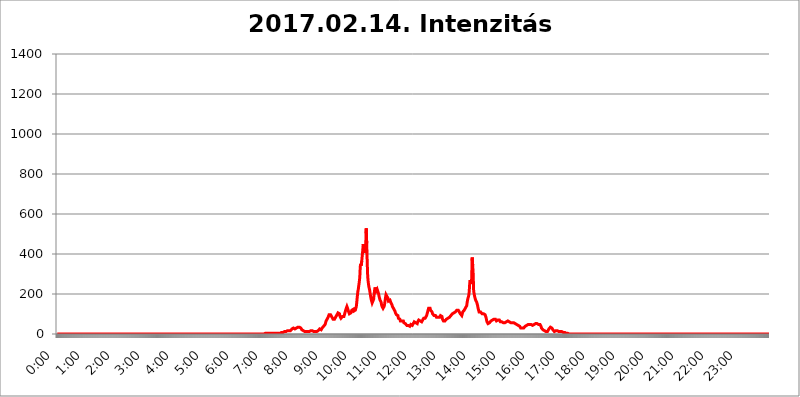
| Category | 2017.02.14. Intenzitás [W/m^2] |
|---|---|
| 0.0 | 0 |
| 0.0006944444444444445 | 0 |
| 0.001388888888888889 | 0 |
| 0.0020833333333333333 | 0 |
| 0.002777777777777778 | 0 |
| 0.003472222222222222 | 0 |
| 0.004166666666666667 | 0 |
| 0.004861111111111111 | 0 |
| 0.005555555555555556 | 0 |
| 0.0062499999999999995 | 0 |
| 0.006944444444444444 | 0 |
| 0.007638888888888889 | 0 |
| 0.008333333333333333 | 0 |
| 0.009027777777777779 | 0 |
| 0.009722222222222222 | 0 |
| 0.010416666666666666 | 0 |
| 0.011111111111111112 | 0 |
| 0.011805555555555555 | 0 |
| 0.012499999999999999 | 0 |
| 0.013194444444444444 | 0 |
| 0.013888888888888888 | 0 |
| 0.014583333333333332 | 0 |
| 0.015277777777777777 | 0 |
| 0.015972222222222224 | 0 |
| 0.016666666666666666 | 0 |
| 0.017361111111111112 | 0 |
| 0.018055555555555557 | 0 |
| 0.01875 | 0 |
| 0.019444444444444445 | 0 |
| 0.02013888888888889 | 0 |
| 0.020833333333333332 | 0 |
| 0.02152777777777778 | 0 |
| 0.022222222222222223 | 0 |
| 0.02291666666666667 | 0 |
| 0.02361111111111111 | 0 |
| 0.024305555555555556 | 0 |
| 0.024999999999999998 | 0 |
| 0.025694444444444447 | 0 |
| 0.02638888888888889 | 0 |
| 0.027083333333333334 | 0 |
| 0.027777777777777776 | 0 |
| 0.02847222222222222 | 0 |
| 0.029166666666666664 | 0 |
| 0.029861111111111113 | 0 |
| 0.030555555555555555 | 0 |
| 0.03125 | 0 |
| 0.03194444444444445 | 0 |
| 0.03263888888888889 | 0 |
| 0.03333333333333333 | 0 |
| 0.034027777777777775 | 0 |
| 0.034722222222222224 | 0 |
| 0.035416666666666666 | 0 |
| 0.036111111111111115 | 0 |
| 0.03680555555555556 | 0 |
| 0.0375 | 0 |
| 0.03819444444444444 | 0 |
| 0.03888888888888889 | 0 |
| 0.03958333333333333 | 0 |
| 0.04027777777777778 | 0 |
| 0.04097222222222222 | 0 |
| 0.041666666666666664 | 0 |
| 0.042361111111111106 | 0 |
| 0.04305555555555556 | 0 |
| 0.043750000000000004 | 0 |
| 0.044444444444444446 | 0 |
| 0.04513888888888889 | 0 |
| 0.04583333333333334 | 0 |
| 0.04652777777777778 | 0 |
| 0.04722222222222222 | 0 |
| 0.04791666666666666 | 0 |
| 0.04861111111111111 | 0 |
| 0.049305555555555554 | 0 |
| 0.049999999999999996 | 0 |
| 0.05069444444444445 | 0 |
| 0.051388888888888894 | 0 |
| 0.052083333333333336 | 0 |
| 0.05277777777777778 | 0 |
| 0.05347222222222222 | 0 |
| 0.05416666666666667 | 0 |
| 0.05486111111111111 | 0 |
| 0.05555555555555555 | 0 |
| 0.05625 | 0 |
| 0.05694444444444444 | 0 |
| 0.057638888888888885 | 0 |
| 0.05833333333333333 | 0 |
| 0.05902777777777778 | 0 |
| 0.059722222222222225 | 0 |
| 0.06041666666666667 | 0 |
| 0.061111111111111116 | 0 |
| 0.06180555555555556 | 0 |
| 0.0625 | 0 |
| 0.06319444444444444 | 0 |
| 0.06388888888888888 | 0 |
| 0.06458333333333334 | 0 |
| 0.06527777777777778 | 0 |
| 0.06597222222222222 | 0 |
| 0.06666666666666667 | 0 |
| 0.06736111111111111 | 0 |
| 0.06805555555555555 | 0 |
| 0.06874999999999999 | 0 |
| 0.06944444444444443 | 0 |
| 0.07013888888888889 | 0 |
| 0.07083333333333333 | 0 |
| 0.07152777777777779 | 0 |
| 0.07222222222222223 | 0 |
| 0.07291666666666667 | 0 |
| 0.07361111111111111 | 0 |
| 0.07430555555555556 | 0 |
| 0.075 | 0 |
| 0.07569444444444444 | 0 |
| 0.0763888888888889 | 0 |
| 0.07708333333333334 | 0 |
| 0.07777777777777778 | 0 |
| 0.07847222222222222 | 0 |
| 0.07916666666666666 | 0 |
| 0.0798611111111111 | 0 |
| 0.08055555555555556 | 0 |
| 0.08125 | 0 |
| 0.08194444444444444 | 0 |
| 0.08263888888888889 | 0 |
| 0.08333333333333333 | 0 |
| 0.08402777777777777 | 0 |
| 0.08472222222222221 | 0 |
| 0.08541666666666665 | 0 |
| 0.08611111111111112 | 0 |
| 0.08680555555555557 | 0 |
| 0.08750000000000001 | 0 |
| 0.08819444444444445 | 0 |
| 0.08888888888888889 | 0 |
| 0.08958333333333333 | 0 |
| 0.09027777777777778 | 0 |
| 0.09097222222222222 | 0 |
| 0.09166666666666667 | 0 |
| 0.09236111111111112 | 0 |
| 0.09305555555555556 | 0 |
| 0.09375 | 0 |
| 0.09444444444444444 | 0 |
| 0.09513888888888888 | 0 |
| 0.09583333333333333 | 0 |
| 0.09652777777777777 | 0 |
| 0.09722222222222222 | 0 |
| 0.09791666666666667 | 0 |
| 0.09861111111111111 | 0 |
| 0.09930555555555555 | 0 |
| 0.09999999999999999 | 0 |
| 0.10069444444444443 | 0 |
| 0.1013888888888889 | 0 |
| 0.10208333333333335 | 0 |
| 0.10277777777777779 | 0 |
| 0.10347222222222223 | 0 |
| 0.10416666666666667 | 0 |
| 0.10486111111111111 | 0 |
| 0.10555555555555556 | 0 |
| 0.10625 | 0 |
| 0.10694444444444444 | 0 |
| 0.1076388888888889 | 0 |
| 0.10833333333333334 | 0 |
| 0.10902777777777778 | 0 |
| 0.10972222222222222 | 0 |
| 0.1111111111111111 | 0 |
| 0.11180555555555556 | 0 |
| 0.11180555555555556 | 0 |
| 0.1125 | 0 |
| 0.11319444444444444 | 0 |
| 0.11388888888888889 | 0 |
| 0.11458333333333333 | 0 |
| 0.11527777777777777 | 0 |
| 0.11597222222222221 | 0 |
| 0.11666666666666665 | 0 |
| 0.1173611111111111 | 0 |
| 0.11805555555555557 | 0 |
| 0.11944444444444445 | 0 |
| 0.12013888888888889 | 0 |
| 0.12083333333333333 | 0 |
| 0.12152777777777778 | 0 |
| 0.12222222222222223 | 0 |
| 0.12291666666666667 | 0 |
| 0.12291666666666667 | 0 |
| 0.12361111111111112 | 0 |
| 0.12430555555555556 | 0 |
| 0.125 | 0 |
| 0.12569444444444444 | 0 |
| 0.12638888888888888 | 0 |
| 0.12708333333333333 | 0 |
| 0.16875 | 0 |
| 0.12847222222222224 | 0 |
| 0.12916666666666668 | 0 |
| 0.12986111111111112 | 0 |
| 0.13055555555555556 | 0 |
| 0.13125 | 0 |
| 0.13194444444444445 | 0 |
| 0.1326388888888889 | 0 |
| 0.13333333333333333 | 0 |
| 0.13402777777777777 | 0 |
| 0.13402777777777777 | 0 |
| 0.13472222222222222 | 0 |
| 0.13541666666666666 | 0 |
| 0.1361111111111111 | 0 |
| 0.13749999999999998 | 0 |
| 0.13819444444444443 | 0 |
| 0.1388888888888889 | 0 |
| 0.13958333333333334 | 0 |
| 0.14027777777777778 | 0 |
| 0.14097222222222222 | 0 |
| 0.14166666666666666 | 0 |
| 0.1423611111111111 | 0 |
| 0.14305555555555557 | 0 |
| 0.14375000000000002 | 0 |
| 0.14444444444444446 | 0 |
| 0.1451388888888889 | 0 |
| 0.1451388888888889 | 0 |
| 0.14652777777777778 | 0 |
| 0.14722222222222223 | 0 |
| 0.14791666666666667 | 0 |
| 0.1486111111111111 | 0 |
| 0.14930555555555555 | 0 |
| 0.15 | 0 |
| 0.15069444444444444 | 0 |
| 0.15138888888888888 | 0 |
| 0.15208333333333332 | 0 |
| 0.15277777777777776 | 0 |
| 0.15347222222222223 | 0 |
| 0.15416666666666667 | 0 |
| 0.15486111111111112 | 0 |
| 0.15555555555555556 | 0 |
| 0.15625 | 0 |
| 0.15694444444444444 | 0 |
| 0.15763888888888888 | 0 |
| 0.15833333333333333 | 0 |
| 0.15902777777777777 | 0 |
| 0.15972222222222224 | 0 |
| 0.16041666666666668 | 0 |
| 0.16111111111111112 | 0 |
| 0.16180555555555556 | 0 |
| 0.1625 | 0 |
| 0.16319444444444445 | 0 |
| 0.1638888888888889 | 0 |
| 0.16458333333333333 | 0 |
| 0.16527777777777777 | 0 |
| 0.16597222222222222 | 0 |
| 0.16666666666666666 | 0 |
| 0.1673611111111111 | 0 |
| 0.16805555555555554 | 0 |
| 0.16874999999999998 | 0 |
| 0.16944444444444443 | 0 |
| 0.17013888888888887 | 0 |
| 0.1708333333333333 | 0 |
| 0.17152777777777775 | 0 |
| 0.17222222222222225 | 0 |
| 0.1729166666666667 | 0 |
| 0.17361111111111113 | 0 |
| 0.17430555555555557 | 0 |
| 0.17500000000000002 | 0 |
| 0.17569444444444446 | 0 |
| 0.1763888888888889 | 0 |
| 0.17708333333333334 | 0 |
| 0.17777777777777778 | 0 |
| 0.17847222222222223 | 0 |
| 0.17916666666666667 | 0 |
| 0.1798611111111111 | 0 |
| 0.18055555555555555 | 0 |
| 0.18125 | 0 |
| 0.18194444444444444 | 0 |
| 0.1826388888888889 | 0 |
| 0.18333333333333335 | 0 |
| 0.1840277777777778 | 0 |
| 0.18472222222222223 | 0 |
| 0.18541666666666667 | 0 |
| 0.18611111111111112 | 0 |
| 0.18680555555555556 | 0 |
| 0.1875 | 0 |
| 0.18819444444444444 | 0 |
| 0.18888888888888888 | 0 |
| 0.18958333333333333 | 0 |
| 0.19027777777777777 | 0 |
| 0.1909722222222222 | 0 |
| 0.19166666666666665 | 0 |
| 0.19236111111111112 | 0 |
| 0.19305555555555554 | 0 |
| 0.19375 | 0 |
| 0.19444444444444445 | 0 |
| 0.1951388888888889 | 0 |
| 0.19583333333333333 | 0 |
| 0.19652777777777777 | 0 |
| 0.19722222222222222 | 0 |
| 0.19791666666666666 | 0 |
| 0.1986111111111111 | 0 |
| 0.19930555555555554 | 0 |
| 0.19999999999999998 | 0 |
| 0.20069444444444443 | 0 |
| 0.20138888888888887 | 0 |
| 0.2020833333333333 | 0 |
| 0.2027777777777778 | 0 |
| 0.2034722222222222 | 0 |
| 0.2041666666666667 | 0 |
| 0.20486111111111113 | 0 |
| 0.20555555555555557 | 0 |
| 0.20625000000000002 | 0 |
| 0.20694444444444446 | 0 |
| 0.2076388888888889 | 0 |
| 0.20833333333333334 | 0 |
| 0.20902777777777778 | 0 |
| 0.20972222222222223 | 0 |
| 0.21041666666666667 | 0 |
| 0.2111111111111111 | 0 |
| 0.21180555555555555 | 0 |
| 0.2125 | 0 |
| 0.21319444444444444 | 0 |
| 0.2138888888888889 | 0 |
| 0.21458333333333335 | 0 |
| 0.2152777777777778 | 0 |
| 0.21597222222222223 | 0 |
| 0.21666666666666667 | 0 |
| 0.21736111111111112 | 0 |
| 0.21805555555555556 | 0 |
| 0.21875 | 0 |
| 0.21944444444444444 | 0 |
| 0.22013888888888888 | 0 |
| 0.22083333333333333 | 0 |
| 0.22152777777777777 | 0 |
| 0.2222222222222222 | 0 |
| 0.22291666666666665 | 0 |
| 0.2236111111111111 | 0 |
| 0.22430555555555556 | 0 |
| 0.225 | 0 |
| 0.22569444444444445 | 0 |
| 0.2263888888888889 | 0 |
| 0.22708333333333333 | 0 |
| 0.22777777777777777 | 0 |
| 0.22847222222222222 | 0 |
| 0.22916666666666666 | 0 |
| 0.2298611111111111 | 0 |
| 0.23055555555555554 | 0 |
| 0.23124999999999998 | 0 |
| 0.23194444444444443 | 0 |
| 0.23263888888888887 | 0 |
| 0.2333333333333333 | 0 |
| 0.2340277777777778 | 0 |
| 0.2347222222222222 | 0 |
| 0.2354166666666667 | 0 |
| 0.23611111111111113 | 0 |
| 0.23680555555555557 | 0 |
| 0.23750000000000002 | 0 |
| 0.23819444444444446 | 0 |
| 0.2388888888888889 | 0 |
| 0.23958333333333334 | 0 |
| 0.24027777777777778 | 0 |
| 0.24097222222222223 | 0 |
| 0.24166666666666667 | 0 |
| 0.2423611111111111 | 0 |
| 0.24305555555555555 | 0 |
| 0.24375 | 0 |
| 0.24444444444444446 | 0 |
| 0.24513888888888888 | 0 |
| 0.24583333333333335 | 0 |
| 0.2465277777777778 | 0 |
| 0.24722222222222223 | 0 |
| 0.24791666666666667 | 0 |
| 0.24861111111111112 | 0 |
| 0.24930555555555556 | 0 |
| 0.25 | 0 |
| 0.25069444444444444 | 0 |
| 0.2513888888888889 | 0 |
| 0.2520833333333333 | 0 |
| 0.25277777777777777 | 0 |
| 0.2534722222222222 | 0 |
| 0.25416666666666665 | 0 |
| 0.2548611111111111 | 0 |
| 0.2555555555555556 | 0 |
| 0.25625000000000003 | 0 |
| 0.2569444444444445 | 0 |
| 0.2576388888888889 | 0 |
| 0.25833333333333336 | 0 |
| 0.2590277777777778 | 0 |
| 0.25972222222222224 | 0 |
| 0.2604166666666667 | 0 |
| 0.2611111111111111 | 0 |
| 0.26180555555555557 | 0 |
| 0.2625 | 0 |
| 0.26319444444444445 | 0 |
| 0.2638888888888889 | 0 |
| 0.26458333333333334 | 0 |
| 0.2652777777777778 | 0 |
| 0.2659722222222222 | 0 |
| 0.26666666666666666 | 0 |
| 0.2673611111111111 | 0 |
| 0.26805555555555555 | 0 |
| 0.26875 | 0 |
| 0.26944444444444443 | 0 |
| 0.2701388888888889 | 0 |
| 0.2708333333333333 | 0 |
| 0.27152777777777776 | 0 |
| 0.2722222222222222 | 0 |
| 0.27291666666666664 | 0 |
| 0.2736111111111111 | 0 |
| 0.2743055555555555 | 0 |
| 0.27499999999999997 | 0 |
| 0.27569444444444446 | 0 |
| 0.27638888888888885 | 0 |
| 0.27708333333333335 | 0 |
| 0.2777777777777778 | 0 |
| 0.27847222222222223 | 0 |
| 0.2791666666666667 | 0 |
| 0.2798611111111111 | 0 |
| 0.28055555555555556 | 0 |
| 0.28125 | 0 |
| 0.28194444444444444 | 0 |
| 0.2826388888888889 | 0 |
| 0.2833333333333333 | 0 |
| 0.28402777777777777 | 0 |
| 0.2847222222222222 | 0 |
| 0.28541666666666665 | 0 |
| 0.28611111111111115 | 0 |
| 0.28680555555555554 | 0 |
| 0.28750000000000003 | 0 |
| 0.2881944444444445 | 0 |
| 0.2888888888888889 | 0 |
| 0.28958333333333336 | 0 |
| 0.2902777777777778 | 3.525 |
| 0.29097222222222224 | 3.525 |
| 0.2916666666666667 | 3.525 |
| 0.2923611111111111 | 3.525 |
| 0.29305555555555557 | 3.525 |
| 0.29375 | 3.525 |
| 0.29444444444444445 | 3.525 |
| 0.2951388888888889 | 3.525 |
| 0.29583333333333334 | 3.525 |
| 0.2965277777777778 | 3.525 |
| 0.2972222222222222 | 3.525 |
| 0.29791666666666666 | 3.525 |
| 0.2986111111111111 | 3.525 |
| 0.29930555555555555 | 3.525 |
| 0.3 | 3.525 |
| 0.30069444444444443 | 3.525 |
| 0.3013888888888889 | 3.525 |
| 0.3020833333333333 | 3.525 |
| 0.30277777777777776 | 3.525 |
| 0.3034722222222222 | 3.525 |
| 0.30416666666666664 | 3.525 |
| 0.3048611111111111 | 3.525 |
| 0.3055555555555555 | 3.525 |
| 0.30624999999999997 | 3.525 |
| 0.3069444444444444 | 3.525 |
| 0.3076388888888889 | 3.525 |
| 0.30833333333333335 | 3.525 |
| 0.3090277777777778 | 3.525 |
| 0.30972222222222223 | 3.525 |
| 0.3104166666666667 | 3.525 |
| 0.3111111111111111 | 3.525 |
| 0.31180555555555556 | 3.525 |
| 0.3125 | 3.525 |
| 0.31319444444444444 | 7.887 |
| 0.3138888888888889 | 7.887 |
| 0.3145833333333333 | 7.887 |
| 0.31527777777777777 | 7.887 |
| 0.3159722222222222 | 7.887 |
| 0.31666666666666665 | 7.887 |
| 0.31736111111111115 | 12.257 |
| 0.31805555555555554 | 12.257 |
| 0.31875000000000003 | 12.257 |
| 0.3194444444444445 | 12.257 |
| 0.3201388888888889 | 12.257 |
| 0.32083333333333336 | 12.257 |
| 0.3215277777777778 | 12.257 |
| 0.32222222222222224 | 12.257 |
| 0.3229166666666667 | 16.636 |
| 0.3236111111111111 | 16.636 |
| 0.32430555555555557 | 16.636 |
| 0.325 | 16.636 |
| 0.32569444444444445 | 16.636 |
| 0.3263888888888889 | 16.636 |
| 0.32708333333333334 | 16.636 |
| 0.3277777777777778 | 21.024 |
| 0.3284722222222222 | 21.024 |
| 0.32916666666666666 | 25.419 |
| 0.3298611111111111 | 25.419 |
| 0.33055555555555555 | 25.419 |
| 0.33125 | 29.823 |
| 0.33194444444444443 | 29.823 |
| 0.3326388888888889 | 25.419 |
| 0.3333333333333333 | 25.419 |
| 0.3340277777777778 | 25.419 |
| 0.3347222222222222 | 25.419 |
| 0.3354166666666667 | 29.823 |
| 0.3361111111111111 | 29.823 |
| 0.3368055555555556 | 29.823 |
| 0.33749999999999997 | 34.234 |
| 0.33819444444444446 | 34.234 |
| 0.33888888888888885 | 34.234 |
| 0.33958333333333335 | 34.234 |
| 0.34027777777777773 | 34.234 |
| 0.34097222222222223 | 29.823 |
| 0.3416666666666666 | 29.823 |
| 0.3423611111111111 | 25.419 |
| 0.3430555555555555 | 21.024 |
| 0.34375 | 21.024 |
| 0.3444444444444445 | 16.636 |
| 0.3451388888888889 | 16.636 |
| 0.3458333333333334 | 16.636 |
| 0.34652777777777777 | 12.257 |
| 0.34722222222222227 | 12.257 |
| 0.34791666666666665 | 12.257 |
| 0.34861111111111115 | 12.257 |
| 0.34930555555555554 | 12.257 |
| 0.35000000000000003 | 12.257 |
| 0.3506944444444444 | 12.257 |
| 0.3513888888888889 | 12.257 |
| 0.3520833333333333 | 12.257 |
| 0.3527777777777778 | 12.257 |
| 0.3534722222222222 | 12.257 |
| 0.3541666666666667 | 12.257 |
| 0.3548611111111111 | 12.257 |
| 0.35555555555555557 | 16.636 |
| 0.35625 | 16.636 |
| 0.35694444444444445 | 16.636 |
| 0.3576388888888889 | 16.636 |
| 0.35833333333333334 | 16.636 |
| 0.3590277777777778 | 16.636 |
| 0.3597222222222222 | 12.257 |
| 0.36041666666666666 | 12.257 |
| 0.3611111111111111 | 12.257 |
| 0.36180555555555555 | 12.257 |
| 0.3625 | 12.257 |
| 0.36319444444444443 | 12.257 |
| 0.3638888888888889 | 12.257 |
| 0.3645833333333333 | 12.257 |
| 0.3652777777777778 | 16.636 |
| 0.3659722222222222 | 16.636 |
| 0.3666666666666667 | 21.024 |
| 0.3673611111111111 | 21.024 |
| 0.3680555555555556 | 25.419 |
| 0.36874999999999997 | 25.419 |
| 0.36944444444444446 | 25.419 |
| 0.37013888888888885 | 21.024 |
| 0.37083333333333335 | 25.419 |
| 0.37152777777777773 | 29.823 |
| 0.37222222222222223 | 29.823 |
| 0.3729166666666666 | 34.234 |
| 0.3736111111111111 | 38.653 |
| 0.3743055555555555 | 38.653 |
| 0.375 | 43.079 |
| 0.3756944444444445 | 47.511 |
| 0.3763888888888889 | 56.398 |
| 0.3770833333333334 | 65.31 |
| 0.37777777777777777 | 69.775 |
| 0.37847222222222227 | 74.246 |
| 0.37916666666666665 | 78.722 |
| 0.37986111111111115 | 83.205 |
| 0.38055555555555554 | 87.692 |
| 0.38125000000000003 | 96.682 |
| 0.3819444444444444 | 101.184 |
| 0.3826388888888889 | 101.184 |
| 0.3833333333333333 | 96.682 |
| 0.3840277777777778 | 92.184 |
| 0.3847222222222222 | 92.184 |
| 0.3854166666666667 | 83.205 |
| 0.3861111111111111 | 78.722 |
| 0.38680555555555557 | 74.246 |
| 0.3875 | 74.246 |
| 0.38819444444444445 | 74.246 |
| 0.3888888888888889 | 74.246 |
| 0.38958333333333334 | 74.246 |
| 0.3902777777777778 | 78.722 |
| 0.3909722222222222 | 87.692 |
| 0.39166666666666666 | 92.184 |
| 0.3923611111111111 | 96.682 |
| 0.39305555555555555 | 101.184 |
| 0.39375 | 105.69 |
| 0.39444444444444443 | 105.69 |
| 0.3951388888888889 | 105.69 |
| 0.3958333333333333 | 101.184 |
| 0.3965277777777778 | 87.692 |
| 0.3972222222222222 | 83.205 |
| 0.3979166666666667 | 78.722 |
| 0.3986111111111111 | 78.722 |
| 0.3993055555555556 | 83.205 |
| 0.39999999999999997 | 87.692 |
| 0.40069444444444446 | 87.692 |
| 0.40138888888888885 | 83.205 |
| 0.40208333333333335 | 87.692 |
| 0.40277777777777773 | 96.682 |
| 0.40347222222222223 | 105.69 |
| 0.4041666666666666 | 114.716 |
| 0.4048611111111111 | 123.758 |
| 0.4055555555555555 | 128.284 |
| 0.40625 | 137.347 |
| 0.4069444444444445 | 137.347 |
| 0.4076388888888889 | 123.758 |
| 0.4083333333333334 | 114.716 |
| 0.40902777777777777 | 110.201 |
| 0.40972222222222227 | 101.184 |
| 0.41041666666666665 | 101.184 |
| 0.41111111111111115 | 101.184 |
| 0.41180555555555554 | 105.69 |
| 0.41250000000000003 | 110.201 |
| 0.4131944444444444 | 119.235 |
| 0.4138888888888889 | 123.758 |
| 0.4145833333333333 | 123.758 |
| 0.4152777777777778 | 123.758 |
| 0.4159722222222222 | 114.716 |
| 0.4166666666666667 | 114.716 |
| 0.4173611111111111 | 119.235 |
| 0.41805555555555557 | 119.235 |
| 0.41875 | 123.758 |
| 0.41944444444444445 | 137.347 |
| 0.4201388888888889 | 160.056 |
| 0.42083333333333334 | 187.378 |
| 0.4215277777777778 | 210.182 |
| 0.4222222222222222 | 223.873 |
| 0.42291666666666666 | 242.127 |
| 0.4236111111111111 | 260.373 |
| 0.42430555555555555 | 283.156 |
| 0.425 | 337.639 |
| 0.42569444444444443 | 351.198 |
| 0.4263888888888889 | 342.162 |
| 0.4270833333333333 | 364.728 |
| 0.4277777777777778 | 391.685 |
| 0.4284722222222222 | 418.492 |
| 0.4291666666666667 | 449.551 |
| 0.4298611111111111 | 436.27 |
| 0.4305555555555556 | 405.108 |
| 0.43124999999999997 | 409.574 |
| 0.43194444444444446 | 409.574 |
| 0.43263888888888885 | 440.702 |
| 0.43333333333333335 | 528.2 |
| 0.43402777777777773 | 453.968 |
| 0.43472222222222223 | 360.221 |
| 0.4354166666666666 | 287.709 |
| 0.4361111111111111 | 260.373 |
| 0.4368055555555555 | 242.127 |
| 0.4375 | 228.436 |
| 0.4381944444444445 | 219.309 |
| 0.4388888888888889 | 201.058 |
| 0.4395833333333334 | 187.378 |
| 0.44027777777777777 | 173.709 |
| 0.44097222222222227 | 164.605 |
| 0.44166666666666665 | 155.509 |
| 0.44236111111111115 | 150.964 |
| 0.44305555555555554 | 160.056 |
| 0.44375000000000003 | 173.709 |
| 0.4444444444444444 | 201.058 |
| 0.4451388888888889 | 219.309 |
| 0.4458333333333333 | 233 |
| 0.4465277777777778 | 223.873 |
| 0.4472222222222222 | 214.746 |
| 0.4479166666666667 | 214.746 |
| 0.4486111111111111 | 223.873 |
| 0.44930555555555557 | 228.436 |
| 0.45 | 219.309 |
| 0.45069444444444445 | 201.058 |
| 0.4513888888888889 | 187.378 |
| 0.45208333333333334 | 178.264 |
| 0.4527777777777778 | 169.156 |
| 0.4534722222222222 | 164.605 |
| 0.45416666666666666 | 160.056 |
| 0.4548611111111111 | 146.423 |
| 0.45555555555555555 | 137.347 |
| 0.45625 | 132.814 |
| 0.45694444444444443 | 128.284 |
| 0.4576388888888889 | 132.814 |
| 0.4583333333333333 | 137.347 |
| 0.4590277777777778 | 146.423 |
| 0.4597222222222222 | 164.605 |
| 0.4604166666666667 | 182.82 |
| 0.4611111111111111 | 196.497 |
| 0.4618055555555556 | 201.058 |
| 0.46249999999999997 | 187.378 |
| 0.46319444444444446 | 187.378 |
| 0.46388888888888885 | 178.264 |
| 0.46458333333333335 | 164.605 |
| 0.46527777777777773 | 164.605 |
| 0.46597222222222223 | 164.605 |
| 0.4666666666666666 | 169.156 |
| 0.4673611111111111 | 164.605 |
| 0.4680555555555555 | 155.509 |
| 0.46875 | 150.964 |
| 0.4694444444444445 | 146.423 |
| 0.4701388888888889 | 137.347 |
| 0.4708333333333334 | 132.814 |
| 0.47152777777777777 | 128.284 |
| 0.47222222222222227 | 128.284 |
| 0.47291666666666665 | 128.284 |
| 0.47361111111111115 | 114.716 |
| 0.47430555555555554 | 105.69 |
| 0.47500000000000003 | 101.184 |
| 0.4756944444444444 | 96.682 |
| 0.4763888888888889 | 96.682 |
| 0.4770833333333333 | 96.682 |
| 0.4777777777777778 | 92.184 |
| 0.4784722222222222 | 78.722 |
| 0.4791666666666667 | 74.246 |
| 0.4798611111111111 | 78.722 |
| 0.48055555555555557 | 74.246 |
| 0.48125 | 65.31 |
| 0.48194444444444445 | 65.31 |
| 0.4826388888888889 | 65.31 |
| 0.48333333333333334 | 65.31 |
| 0.4840277777777778 | 65.31 |
| 0.4847222222222222 | 65.31 |
| 0.48541666666666666 | 65.31 |
| 0.4861111111111111 | 56.398 |
| 0.48680555555555555 | 56.398 |
| 0.4875 | 56.398 |
| 0.48819444444444443 | 51.951 |
| 0.4888888888888889 | 47.511 |
| 0.4895833333333333 | 47.511 |
| 0.4902777777777778 | 43.079 |
| 0.4909722222222222 | 43.079 |
| 0.4916666666666667 | 43.079 |
| 0.4923611111111111 | 43.079 |
| 0.4930555555555556 | 38.653 |
| 0.49374999999999997 | 38.653 |
| 0.49444444444444446 | 38.653 |
| 0.49513888888888885 | 43.079 |
| 0.49583333333333335 | 47.511 |
| 0.49652777777777773 | 47.511 |
| 0.49722222222222223 | 43.079 |
| 0.4979166666666666 | 43.079 |
| 0.4986111111111111 | 47.511 |
| 0.4993055555555555 | 51.951 |
| 0.5 | 56.398 |
| 0.5006944444444444 | 60.85 |
| 0.5013888888888889 | 60.85 |
| 0.5020833333333333 | 60.85 |
| 0.5027777777777778 | 56.398 |
| 0.5034722222222222 | 56.398 |
| 0.5041666666666667 | 56.398 |
| 0.5048611111111111 | 51.951 |
| 0.5055555555555555 | 60.85 |
| 0.50625 | 65.31 |
| 0.5069444444444444 | 69.775 |
| 0.5076388888888889 | 74.246 |
| 0.5083333333333333 | 69.775 |
| 0.5090277777777777 | 65.31 |
| 0.5097222222222222 | 65.31 |
| 0.5104166666666666 | 60.85 |
| 0.5111111111111112 | 60.85 |
| 0.5118055555555555 | 65.31 |
| 0.5125000000000001 | 69.775 |
| 0.5131944444444444 | 74.246 |
| 0.513888888888889 | 78.722 |
| 0.5145833333333333 | 78.722 |
| 0.5152777777777778 | 83.205 |
| 0.5159722222222222 | 78.722 |
| 0.5166666666666667 | 78.722 |
| 0.517361111111111 | 83.205 |
| 0.5180555555555556 | 92.184 |
| 0.5187499999999999 | 96.682 |
| 0.5194444444444445 | 110.201 |
| 0.5201388888888888 | 119.235 |
| 0.5208333333333334 | 128.284 |
| 0.5215277777777778 | 128.284 |
| 0.5222222222222223 | 128.284 |
| 0.5229166666666667 | 128.284 |
| 0.5236111111111111 | 119.235 |
| 0.5243055555555556 | 114.716 |
| 0.525 | 114.716 |
| 0.5256944444444445 | 110.201 |
| 0.5263888888888889 | 101.184 |
| 0.5270833333333333 | 101.184 |
| 0.5277777777777778 | 96.682 |
| 0.5284722222222222 | 92.184 |
| 0.5291666666666667 | 92.184 |
| 0.5298611111111111 | 92.184 |
| 0.5305555555555556 | 92.184 |
| 0.53125 | 87.692 |
| 0.5319444444444444 | 83.205 |
| 0.5326388888888889 | 87.692 |
| 0.5333333333333333 | 87.692 |
| 0.5340277777777778 | 83.205 |
| 0.5347222222222222 | 83.205 |
| 0.5354166666666667 | 83.205 |
| 0.5361111111111111 | 83.205 |
| 0.5368055555555555 | 87.692 |
| 0.5375 | 92.184 |
| 0.5381944444444444 | 92.184 |
| 0.5388888888888889 | 92.184 |
| 0.5395833333333333 | 87.692 |
| 0.5402777777777777 | 74.246 |
| 0.5409722222222222 | 69.775 |
| 0.5416666666666666 | 65.31 |
| 0.5423611111111112 | 65.31 |
| 0.5430555555555555 | 65.31 |
| 0.5437500000000001 | 65.31 |
| 0.5444444444444444 | 65.31 |
| 0.545138888888889 | 69.775 |
| 0.5458333333333333 | 74.246 |
| 0.5465277777777778 | 74.246 |
| 0.5472222222222222 | 78.722 |
| 0.5479166666666667 | 78.722 |
| 0.548611111111111 | 78.722 |
| 0.5493055555555556 | 78.722 |
| 0.5499999999999999 | 83.205 |
| 0.5506944444444445 | 83.205 |
| 0.5513888888888888 | 87.692 |
| 0.5520833333333334 | 92.184 |
| 0.5527777777777778 | 96.682 |
| 0.5534722222222223 | 96.682 |
| 0.5541666666666667 | 101.184 |
| 0.5548611111111111 | 105.69 |
| 0.5555555555555556 | 105.69 |
| 0.55625 | 105.69 |
| 0.5569444444444445 | 105.69 |
| 0.5576388888888889 | 105.69 |
| 0.5583333333333333 | 110.201 |
| 0.5590277777777778 | 114.716 |
| 0.5597222222222222 | 114.716 |
| 0.5604166666666667 | 119.235 |
| 0.5611111111111111 | 119.235 |
| 0.5618055555555556 | 119.235 |
| 0.5625 | 119.235 |
| 0.5631944444444444 | 114.716 |
| 0.5638888888888889 | 110.201 |
| 0.5645833333333333 | 105.69 |
| 0.5652777777777778 | 101.184 |
| 0.5659722222222222 | 101.184 |
| 0.5666666666666667 | 96.682 |
| 0.5673611111111111 | 92.184 |
| 0.5680555555555555 | 101.184 |
| 0.56875 | 110.201 |
| 0.5694444444444444 | 110.201 |
| 0.5701388888888889 | 114.716 |
| 0.5708333333333333 | 119.235 |
| 0.5715277777777777 | 123.758 |
| 0.5722222222222222 | 128.284 |
| 0.5729166666666666 | 128.284 |
| 0.5736111111111112 | 128.284 |
| 0.5743055555555555 | 141.884 |
| 0.5750000000000001 | 160.056 |
| 0.5756944444444444 | 173.709 |
| 0.576388888888889 | 178.264 |
| 0.5770833333333333 | 191.937 |
| 0.5777777777777778 | 210.182 |
| 0.5784722222222222 | 251.251 |
| 0.5791666666666667 | 269.49 |
| 0.579861111111111 | 251.251 |
| 0.5805555555555556 | 251.251 |
| 0.5812499999999999 | 274.047 |
| 0.5819444444444445 | 382.715 |
| 0.5826388888888888 | 346.682 |
| 0.5833333333333334 | 301.354 |
| 0.5840277777777778 | 214.746 |
| 0.5847222222222223 | 201.058 |
| 0.5854166666666667 | 187.378 |
| 0.5861111111111111 | 182.82 |
| 0.5868055555555556 | 169.156 |
| 0.5875 | 164.605 |
| 0.5881944444444445 | 160.056 |
| 0.5888888888888889 | 150.964 |
| 0.5895833333333333 | 141.884 |
| 0.5902777777777778 | 128.284 |
| 0.5909722222222222 | 119.235 |
| 0.5916666666666667 | 110.201 |
| 0.5923611111111111 | 110.201 |
| 0.5930555555555556 | 110.201 |
| 0.59375 | 110.201 |
| 0.5944444444444444 | 110.201 |
| 0.5951388888888889 | 105.69 |
| 0.5958333333333333 | 101.184 |
| 0.5965277777777778 | 96.682 |
| 0.5972222222222222 | 101.184 |
| 0.5979166666666667 | 101.184 |
| 0.5986111111111111 | 101.184 |
| 0.5993055555555555 | 101.184 |
| 0.6 | 96.682 |
| 0.6006944444444444 | 92.184 |
| 0.6013888888888889 | 83.205 |
| 0.6020833333333333 | 69.775 |
| 0.6027777777777777 | 60.85 |
| 0.6034722222222222 | 56.398 |
| 0.6041666666666666 | 51.951 |
| 0.6048611111111112 | 51.951 |
| 0.6055555555555555 | 56.398 |
| 0.6062500000000001 | 56.398 |
| 0.6069444444444444 | 60.85 |
| 0.607638888888889 | 60.85 |
| 0.6083333333333333 | 65.31 |
| 0.6090277777777778 | 69.775 |
| 0.6097222222222222 | 69.775 |
| 0.6104166666666667 | 69.775 |
| 0.611111111111111 | 69.775 |
| 0.6118055555555556 | 74.246 |
| 0.6124999999999999 | 74.246 |
| 0.6131944444444445 | 69.775 |
| 0.6138888888888888 | 74.246 |
| 0.6145833333333334 | 74.246 |
| 0.6152777777777778 | 69.775 |
| 0.6159722222222223 | 65.31 |
| 0.6166666666666667 | 60.85 |
| 0.6173611111111111 | 65.31 |
| 0.6180555555555556 | 69.775 |
| 0.61875 | 74.246 |
| 0.6194444444444445 | 74.246 |
| 0.6201388888888889 | 69.775 |
| 0.6208333333333333 | 65.31 |
| 0.6215277777777778 | 60.85 |
| 0.6222222222222222 | 60.85 |
| 0.6229166666666667 | 60.85 |
| 0.6236111111111111 | 60.85 |
| 0.6243055555555556 | 60.85 |
| 0.625 | 60.85 |
| 0.6256944444444444 | 56.398 |
| 0.6263888888888889 | 56.398 |
| 0.6270833333333333 | 56.398 |
| 0.6277777777777778 | 56.398 |
| 0.6284722222222222 | 56.398 |
| 0.6291666666666667 | 56.398 |
| 0.6298611111111111 | 60.85 |
| 0.6305555555555555 | 60.85 |
| 0.63125 | 60.85 |
| 0.6319444444444444 | 65.31 |
| 0.6326388888888889 | 65.31 |
| 0.6333333333333333 | 60.85 |
| 0.6340277777777777 | 60.85 |
| 0.6347222222222222 | 60.85 |
| 0.6354166666666666 | 56.398 |
| 0.6361111111111112 | 56.398 |
| 0.6368055555555555 | 56.398 |
| 0.6375000000000001 | 56.398 |
| 0.6381944444444444 | 56.398 |
| 0.638888888888889 | 56.398 |
| 0.6395833333333333 | 56.398 |
| 0.6402777777777778 | 56.398 |
| 0.6409722222222222 | 56.398 |
| 0.6416666666666667 | 51.951 |
| 0.642361111111111 | 51.951 |
| 0.6430555555555556 | 47.511 |
| 0.6437499999999999 | 47.511 |
| 0.6444444444444445 | 47.511 |
| 0.6451388888888888 | 47.511 |
| 0.6458333333333334 | 43.079 |
| 0.6465277777777778 | 43.079 |
| 0.6472222222222223 | 43.079 |
| 0.6479166666666667 | 38.653 |
| 0.6486111111111111 | 38.653 |
| 0.6493055555555556 | 34.234 |
| 0.65 | 29.823 |
| 0.6506944444444445 | 29.823 |
| 0.6513888888888889 | 29.823 |
| 0.6520833333333333 | 29.823 |
| 0.6527777777777778 | 29.823 |
| 0.6534722222222222 | 29.823 |
| 0.6541666666666667 | 29.823 |
| 0.6548611111111111 | 34.234 |
| 0.6555555555555556 | 34.234 |
| 0.65625 | 38.653 |
| 0.6569444444444444 | 38.653 |
| 0.6576388888888889 | 38.653 |
| 0.6583333333333333 | 43.079 |
| 0.6590277777777778 | 43.079 |
| 0.6597222222222222 | 43.079 |
| 0.6604166666666667 | 47.511 |
| 0.6611111111111111 | 47.511 |
| 0.6618055555555555 | 47.511 |
| 0.6625 | 47.511 |
| 0.6631944444444444 | 47.511 |
| 0.6638888888888889 | 47.511 |
| 0.6645833333333333 | 47.511 |
| 0.6652777777777777 | 43.079 |
| 0.6659722222222222 | 47.511 |
| 0.6666666666666666 | 43.079 |
| 0.6673611111111111 | 47.511 |
| 0.6680555555555556 | 43.079 |
| 0.6687500000000001 | 47.511 |
| 0.6694444444444444 | 47.511 |
| 0.6701388888888888 | 47.511 |
| 0.6708333333333334 | 51.951 |
| 0.6715277777777778 | 51.951 |
| 0.6722222222222222 | 51.951 |
| 0.6729166666666666 | 51.951 |
| 0.6736111111111112 | 51.951 |
| 0.6743055555555556 | 51.951 |
| 0.6749999999999999 | 47.511 |
| 0.6756944444444444 | 47.511 |
| 0.6763888888888889 | 47.511 |
| 0.6770833333333334 | 47.511 |
| 0.6777777777777777 | 47.511 |
| 0.6784722222222223 | 38.653 |
| 0.6791666666666667 | 29.823 |
| 0.6798611111111111 | 29.823 |
| 0.6805555555555555 | 25.419 |
| 0.68125 | 21.024 |
| 0.6819444444444445 | 21.024 |
| 0.6826388888888889 | 16.636 |
| 0.6833333333333332 | 16.636 |
| 0.6840277777777778 | 12.257 |
| 0.6847222222222222 | 12.257 |
| 0.6854166666666667 | 12.257 |
| 0.686111111111111 | 12.257 |
| 0.6868055555555556 | 12.257 |
| 0.6875 | 12.257 |
| 0.6881944444444444 | 12.257 |
| 0.688888888888889 | 16.636 |
| 0.6895833333333333 | 25.419 |
| 0.6902777777777778 | 29.823 |
| 0.6909722222222222 | 29.823 |
| 0.6916666666666668 | 34.234 |
| 0.6923611111111111 | 34.234 |
| 0.6930555555555555 | 34.234 |
| 0.69375 | 29.823 |
| 0.6944444444444445 | 25.419 |
| 0.6951388888888889 | 21.024 |
| 0.6958333333333333 | 16.636 |
| 0.6965277777777777 | 16.636 |
| 0.6972222222222223 | 12.257 |
| 0.6979166666666666 | 12.257 |
| 0.6986111111111111 | 12.257 |
| 0.6993055555555556 | 16.636 |
| 0.7000000000000001 | 16.636 |
| 0.7006944444444444 | 16.636 |
| 0.7013888888888888 | 16.636 |
| 0.7020833333333334 | 16.636 |
| 0.7027777777777778 | 16.636 |
| 0.7034722222222222 | 12.257 |
| 0.7041666666666666 | 12.257 |
| 0.7048611111111112 | 12.257 |
| 0.7055555555555556 | 12.257 |
| 0.7062499999999999 | 12.257 |
| 0.7069444444444444 | 12.257 |
| 0.7076388888888889 | 12.257 |
| 0.7083333333333334 | 7.887 |
| 0.7090277777777777 | 7.887 |
| 0.7097222222222223 | 7.887 |
| 0.7104166666666667 | 7.887 |
| 0.7111111111111111 | 7.887 |
| 0.7118055555555555 | 7.887 |
| 0.7125 | 7.887 |
| 0.7131944444444445 | 7.887 |
| 0.7138888888888889 | 3.525 |
| 0.7145833333333332 | 3.525 |
| 0.7152777777777778 | 3.525 |
| 0.7159722222222222 | 3.525 |
| 0.7166666666666667 | 3.525 |
| 0.717361111111111 | 3.525 |
| 0.7180555555555556 | 0 |
| 0.71875 | 0 |
| 0.7194444444444444 | 0 |
| 0.720138888888889 | 0 |
| 0.7208333333333333 | 0 |
| 0.7215277777777778 | 0 |
| 0.7222222222222222 | 0 |
| 0.7229166666666668 | 0 |
| 0.7236111111111111 | 0 |
| 0.7243055555555555 | 0 |
| 0.725 | 0 |
| 0.7256944444444445 | 0 |
| 0.7263888888888889 | 0 |
| 0.7270833333333333 | 0 |
| 0.7277777777777777 | 0 |
| 0.7284722222222223 | 0 |
| 0.7291666666666666 | 0 |
| 0.7298611111111111 | 0 |
| 0.7305555555555556 | 0 |
| 0.7312500000000001 | 0 |
| 0.7319444444444444 | 0 |
| 0.7326388888888888 | 0 |
| 0.7333333333333334 | 0 |
| 0.7340277777777778 | 0 |
| 0.7347222222222222 | 0 |
| 0.7354166666666666 | 0 |
| 0.7361111111111112 | 0 |
| 0.7368055555555556 | 0 |
| 0.7374999999999999 | 0 |
| 0.7381944444444444 | 0 |
| 0.7388888888888889 | 0 |
| 0.7395833333333334 | 0 |
| 0.7402777777777777 | 0 |
| 0.7409722222222223 | 0 |
| 0.7416666666666667 | 0 |
| 0.7423611111111111 | 0 |
| 0.7430555555555555 | 0 |
| 0.74375 | 0 |
| 0.7444444444444445 | 0 |
| 0.7451388888888889 | 0 |
| 0.7458333333333332 | 0 |
| 0.7465277777777778 | 0 |
| 0.7472222222222222 | 0 |
| 0.7479166666666667 | 0 |
| 0.748611111111111 | 0 |
| 0.7493055555555556 | 0 |
| 0.75 | 0 |
| 0.7506944444444444 | 0 |
| 0.751388888888889 | 0 |
| 0.7520833333333333 | 0 |
| 0.7527777777777778 | 0 |
| 0.7534722222222222 | 0 |
| 0.7541666666666668 | 0 |
| 0.7548611111111111 | 0 |
| 0.7555555555555555 | 0 |
| 0.75625 | 0 |
| 0.7569444444444445 | 0 |
| 0.7576388888888889 | 0 |
| 0.7583333333333333 | 0 |
| 0.7590277777777777 | 0 |
| 0.7597222222222223 | 0 |
| 0.7604166666666666 | 0 |
| 0.7611111111111111 | 0 |
| 0.7618055555555556 | 0 |
| 0.7625000000000001 | 0 |
| 0.7631944444444444 | 0 |
| 0.7638888888888888 | 0 |
| 0.7645833333333334 | 0 |
| 0.7652777777777778 | 0 |
| 0.7659722222222222 | 0 |
| 0.7666666666666666 | 0 |
| 0.7673611111111112 | 0 |
| 0.7680555555555556 | 0 |
| 0.7687499999999999 | 0 |
| 0.7694444444444444 | 0 |
| 0.7701388888888889 | 0 |
| 0.7708333333333334 | 0 |
| 0.7715277777777777 | 0 |
| 0.7722222222222223 | 0 |
| 0.7729166666666667 | 0 |
| 0.7736111111111111 | 0 |
| 0.7743055555555555 | 0 |
| 0.775 | 0 |
| 0.7756944444444445 | 0 |
| 0.7763888888888889 | 0 |
| 0.7770833333333332 | 0 |
| 0.7777777777777778 | 0 |
| 0.7784722222222222 | 0 |
| 0.7791666666666667 | 0 |
| 0.779861111111111 | 0 |
| 0.7805555555555556 | 0 |
| 0.78125 | 0 |
| 0.7819444444444444 | 0 |
| 0.782638888888889 | 0 |
| 0.7833333333333333 | 0 |
| 0.7840277777777778 | 0 |
| 0.7847222222222222 | 0 |
| 0.7854166666666668 | 0 |
| 0.7861111111111111 | 0 |
| 0.7868055555555555 | 0 |
| 0.7875 | 0 |
| 0.7881944444444445 | 0 |
| 0.7888888888888889 | 0 |
| 0.7895833333333333 | 0 |
| 0.7902777777777777 | 0 |
| 0.7909722222222223 | 0 |
| 0.7916666666666666 | 0 |
| 0.7923611111111111 | 0 |
| 0.7930555555555556 | 0 |
| 0.7937500000000001 | 0 |
| 0.7944444444444444 | 0 |
| 0.7951388888888888 | 0 |
| 0.7958333333333334 | 0 |
| 0.7965277777777778 | 0 |
| 0.7972222222222222 | 0 |
| 0.7979166666666666 | 0 |
| 0.7986111111111112 | 0 |
| 0.7993055555555556 | 0 |
| 0.7999999999999999 | 0 |
| 0.8006944444444444 | 0 |
| 0.8013888888888889 | 0 |
| 0.8020833333333334 | 0 |
| 0.8027777777777777 | 0 |
| 0.8034722222222223 | 0 |
| 0.8041666666666667 | 0 |
| 0.8048611111111111 | 0 |
| 0.8055555555555555 | 0 |
| 0.80625 | 0 |
| 0.8069444444444445 | 0 |
| 0.8076388888888889 | 0 |
| 0.8083333333333332 | 0 |
| 0.8090277777777778 | 0 |
| 0.8097222222222222 | 0 |
| 0.8104166666666667 | 0 |
| 0.811111111111111 | 0 |
| 0.8118055555555556 | 0 |
| 0.8125 | 0 |
| 0.8131944444444444 | 0 |
| 0.813888888888889 | 0 |
| 0.8145833333333333 | 0 |
| 0.8152777777777778 | 0 |
| 0.8159722222222222 | 0 |
| 0.8166666666666668 | 0 |
| 0.8173611111111111 | 0 |
| 0.8180555555555555 | 0 |
| 0.81875 | 0 |
| 0.8194444444444445 | 0 |
| 0.8201388888888889 | 0 |
| 0.8208333333333333 | 0 |
| 0.8215277777777777 | 0 |
| 0.8222222222222223 | 0 |
| 0.8229166666666666 | 0 |
| 0.8236111111111111 | 0 |
| 0.8243055555555556 | 0 |
| 0.8250000000000001 | 0 |
| 0.8256944444444444 | 0 |
| 0.8263888888888888 | 0 |
| 0.8270833333333334 | 0 |
| 0.8277777777777778 | 0 |
| 0.8284722222222222 | 0 |
| 0.8291666666666666 | 0 |
| 0.8298611111111112 | 0 |
| 0.8305555555555556 | 0 |
| 0.8312499999999999 | 0 |
| 0.8319444444444444 | 0 |
| 0.8326388888888889 | 0 |
| 0.8333333333333334 | 0 |
| 0.8340277777777777 | 0 |
| 0.8347222222222223 | 0 |
| 0.8354166666666667 | 0 |
| 0.8361111111111111 | 0 |
| 0.8368055555555555 | 0 |
| 0.8375 | 0 |
| 0.8381944444444445 | 0 |
| 0.8388888888888889 | 0 |
| 0.8395833333333332 | 0 |
| 0.8402777777777778 | 0 |
| 0.8409722222222222 | 0 |
| 0.8416666666666667 | 0 |
| 0.842361111111111 | 0 |
| 0.8430555555555556 | 0 |
| 0.84375 | 0 |
| 0.8444444444444444 | 0 |
| 0.845138888888889 | 0 |
| 0.8458333333333333 | 0 |
| 0.8465277777777778 | 0 |
| 0.8472222222222222 | 0 |
| 0.8479166666666668 | 0 |
| 0.8486111111111111 | 0 |
| 0.8493055555555555 | 0 |
| 0.85 | 0 |
| 0.8506944444444445 | 0 |
| 0.8513888888888889 | 0 |
| 0.8520833333333333 | 0 |
| 0.8527777777777777 | 0 |
| 0.8534722222222223 | 0 |
| 0.8541666666666666 | 0 |
| 0.8548611111111111 | 0 |
| 0.8555555555555556 | 0 |
| 0.8562500000000001 | 0 |
| 0.8569444444444444 | 0 |
| 0.8576388888888888 | 0 |
| 0.8583333333333334 | 0 |
| 0.8590277777777778 | 0 |
| 0.8597222222222222 | 0 |
| 0.8604166666666666 | 0 |
| 0.8611111111111112 | 0 |
| 0.8618055555555556 | 0 |
| 0.8624999999999999 | 0 |
| 0.8631944444444444 | 0 |
| 0.8638888888888889 | 0 |
| 0.8645833333333334 | 0 |
| 0.8652777777777777 | 0 |
| 0.8659722222222223 | 0 |
| 0.8666666666666667 | 0 |
| 0.8673611111111111 | 0 |
| 0.8680555555555555 | 0 |
| 0.86875 | 0 |
| 0.8694444444444445 | 0 |
| 0.8701388888888889 | 0 |
| 0.8708333333333332 | 0 |
| 0.8715277777777778 | 0 |
| 0.8722222222222222 | 0 |
| 0.8729166666666667 | 0 |
| 0.873611111111111 | 0 |
| 0.8743055555555556 | 0 |
| 0.875 | 0 |
| 0.8756944444444444 | 0 |
| 0.876388888888889 | 0 |
| 0.8770833333333333 | 0 |
| 0.8777777777777778 | 0 |
| 0.8784722222222222 | 0 |
| 0.8791666666666668 | 0 |
| 0.8798611111111111 | 0 |
| 0.8805555555555555 | 0 |
| 0.88125 | 0 |
| 0.8819444444444445 | 0 |
| 0.8826388888888889 | 0 |
| 0.8833333333333333 | 0 |
| 0.8840277777777777 | 0 |
| 0.8847222222222223 | 0 |
| 0.8854166666666666 | 0 |
| 0.8861111111111111 | 0 |
| 0.8868055555555556 | 0 |
| 0.8875000000000001 | 0 |
| 0.8881944444444444 | 0 |
| 0.8888888888888888 | 0 |
| 0.8895833333333334 | 0 |
| 0.8902777777777778 | 0 |
| 0.8909722222222222 | 0 |
| 0.8916666666666666 | 0 |
| 0.8923611111111112 | 0 |
| 0.8930555555555556 | 0 |
| 0.8937499999999999 | 0 |
| 0.8944444444444444 | 0 |
| 0.8951388888888889 | 0 |
| 0.8958333333333334 | 0 |
| 0.8965277777777777 | 0 |
| 0.8972222222222223 | 0 |
| 0.8979166666666667 | 0 |
| 0.8986111111111111 | 0 |
| 0.8993055555555555 | 0 |
| 0.9 | 0 |
| 0.9006944444444445 | 0 |
| 0.9013888888888889 | 0 |
| 0.9020833333333332 | 0 |
| 0.9027777777777778 | 0 |
| 0.9034722222222222 | 0 |
| 0.9041666666666667 | 0 |
| 0.904861111111111 | 0 |
| 0.9055555555555556 | 0 |
| 0.90625 | 0 |
| 0.9069444444444444 | 0 |
| 0.907638888888889 | 0 |
| 0.9083333333333333 | 0 |
| 0.9090277777777778 | 0 |
| 0.9097222222222222 | 0 |
| 0.9104166666666668 | 0 |
| 0.9111111111111111 | 0 |
| 0.9118055555555555 | 0 |
| 0.9125 | 0 |
| 0.9131944444444445 | 0 |
| 0.9138888888888889 | 0 |
| 0.9145833333333333 | 0 |
| 0.9152777777777777 | 0 |
| 0.9159722222222223 | 0 |
| 0.9166666666666666 | 0 |
| 0.9173611111111111 | 0 |
| 0.9180555555555556 | 0 |
| 0.9187500000000001 | 0 |
| 0.9194444444444444 | 0 |
| 0.9201388888888888 | 0 |
| 0.9208333333333334 | 0 |
| 0.9215277777777778 | 0 |
| 0.9222222222222222 | 0 |
| 0.9229166666666666 | 0 |
| 0.9236111111111112 | 0 |
| 0.9243055555555556 | 0 |
| 0.9249999999999999 | 0 |
| 0.9256944444444444 | 0 |
| 0.9263888888888889 | 0 |
| 0.9270833333333334 | 0 |
| 0.9277777777777777 | 0 |
| 0.9284722222222223 | 0 |
| 0.9291666666666667 | 0 |
| 0.9298611111111111 | 0 |
| 0.9305555555555555 | 0 |
| 0.93125 | 0 |
| 0.9319444444444445 | 0 |
| 0.9326388888888889 | 0 |
| 0.9333333333333332 | 0 |
| 0.9340277777777778 | 0 |
| 0.9347222222222222 | 0 |
| 0.9354166666666667 | 0 |
| 0.936111111111111 | 0 |
| 0.9368055555555556 | 0 |
| 0.9375 | 0 |
| 0.9381944444444444 | 0 |
| 0.938888888888889 | 0 |
| 0.9395833333333333 | 0 |
| 0.9402777777777778 | 0 |
| 0.9409722222222222 | 0 |
| 0.9416666666666668 | 0 |
| 0.9423611111111111 | 0 |
| 0.9430555555555555 | 0 |
| 0.94375 | 0 |
| 0.9444444444444445 | 0 |
| 0.9451388888888889 | 0 |
| 0.9458333333333333 | 0 |
| 0.9465277777777777 | 0 |
| 0.9472222222222223 | 0 |
| 0.9479166666666666 | 0 |
| 0.9486111111111111 | 0 |
| 0.9493055555555556 | 0 |
| 0.9500000000000001 | 0 |
| 0.9506944444444444 | 0 |
| 0.9513888888888888 | 0 |
| 0.9520833333333334 | 0 |
| 0.9527777777777778 | 0 |
| 0.9534722222222222 | 0 |
| 0.9541666666666666 | 0 |
| 0.9548611111111112 | 0 |
| 0.9555555555555556 | 0 |
| 0.9562499999999999 | 0 |
| 0.9569444444444444 | 0 |
| 0.9576388888888889 | 0 |
| 0.9583333333333334 | 0 |
| 0.9590277777777777 | 0 |
| 0.9597222222222223 | 0 |
| 0.9604166666666667 | 0 |
| 0.9611111111111111 | 0 |
| 0.9618055555555555 | 0 |
| 0.9625 | 0 |
| 0.9631944444444445 | 0 |
| 0.9638888888888889 | 0 |
| 0.9645833333333332 | 0 |
| 0.9652777777777778 | 0 |
| 0.9659722222222222 | 0 |
| 0.9666666666666667 | 0 |
| 0.967361111111111 | 0 |
| 0.9680555555555556 | 0 |
| 0.96875 | 0 |
| 0.9694444444444444 | 0 |
| 0.970138888888889 | 0 |
| 0.9708333333333333 | 0 |
| 0.9715277777777778 | 0 |
| 0.9722222222222222 | 0 |
| 0.9729166666666668 | 0 |
| 0.9736111111111111 | 0 |
| 0.9743055555555555 | 0 |
| 0.975 | 0 |
| 0.9756944444444445 | 0 |
| 0.9763888888888889 | 0 |
| 0.9770833333333333 | 0 |
| 0.9777777777777777 | 0 |
| 0.9784722222222223 | 0 |
| 0.9791666666666666 | 0 |
| 0.9798611111111111 | 0 |
| 0.9805555555555556 | 0 |
| 0.9812500000000001 | 0 |
| 0.9819444444444444 | 0 |
| 0.9826388888888888 | 0 |
| 0.9833333333333334 | 0 |
| 0.9840277777777778 | 0 |
| 0.9847222222222222 | 0 |
| 0.9854166666666666 | 0 |
| 0.9861111111111112 | 0 |
| 0.9868055555555556 | 0 |
| 0.9874999999999999 | 0 |
| 0.9881944444444444 | 0 |
| 0.9888888888888889 | 0 |
| 0.9895833333333334 | 0 |
| 0.9902777777777777 | 0 |
| 0.9909722222222223 | 0 |
| 0.9916666666666667 | 0 |
| 0.9923611111111111 | 0 |
| 0.9930555555555555 | 0 |
| 0.99375 | 0 |
| 0.9944444444444445 | 0 |
| 0.9951388888888889 | 0 |
| 0.9958333333333332 | 0 |
| 0.9965277777777778 | 0 |
| 0.9972222222222222 | 0 |
| 0.9979166666666667 | 0 |
| 0.998611111111111 | 0 |
| 0.9993055555555556 | 0 |